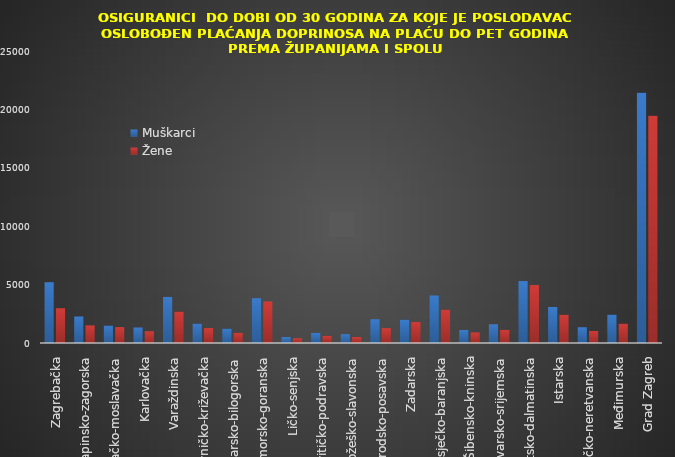
| Category | Muškarci | Žene |
|---|---|---|
| Zagrebačka | 5205 | 2978 |
| Krapinsko-zagorska | 2270 | 1509 |
| Sisačko-moslavačka | 1493 | 1360 |
| Karlovačka | 1329 | 1011 |
| Varaždinska | 3951 | 2696 |
| Koprivničko-križevačka | 1668 | 1276 |
| Bjelovarsko-bilogorska | 1232 | 864 |
| Primorsko-goranska | 3836 | 3557 |
| Ličko-senjska | 511 | 408 |
| Virovitičko-podravska | 862 | 620 |
| Požeško-slavonska | 759 | 513 |
| Brodsko-posavska | 2039 | 1272 |
| Zadarska | 1997 | 1806 |
| Osječko-baranjska | 4067 | 2861 |
| Šibensko-kninska | 1112 | 908 |
| Vukovarsko-srijemska | 1604 | 1126 |
| Splitsko-dalmatinska | 5304 | 4962 |
| Istarska | 3082 | 2414 |
| Dubrovačko-neretvanska | 1351 | 1029 |
| Međimurska | 2425 | 1656 |
| Grad Zagreb | 21435 | 19452 |